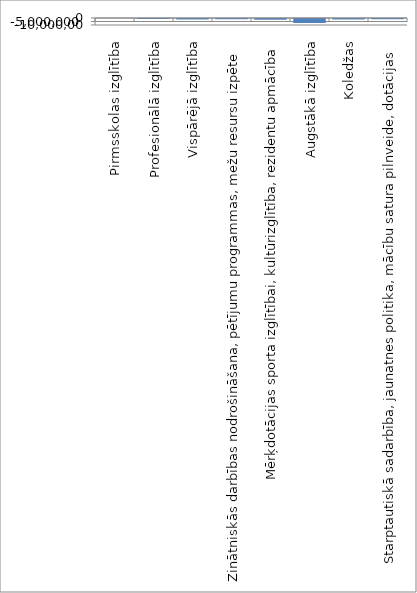
| Category | Series 0 |
|---|---|
| Pirmsskolas izglītība | 0 |
| Profesionālā izglītība | -101568.92 |
| Vispārējā izglītība | -585410.369 |
| Zinātniskās darbības nodrošināšana, pētījumu programmas, mežu resursu izpēte | -211637.406 |
| Mērķdotācijas sporta izglītībai, kultūrizglītība, rezidentu apmācība | -1063394.8 |
| Augstākā izglītība | -5657329.229 |
| Koledžas | -701706.829 |
| Starptautiskā sadarbība, jaunatnes politika, mācību satura pilnveide, dotācijas | -430374.66 |